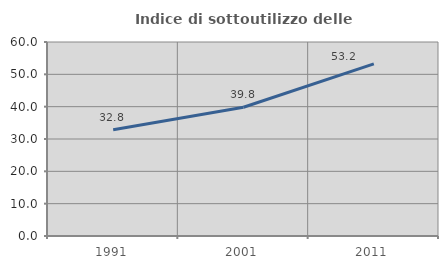
| Category | Indice di sottoutilizzo delle abitazioni  |
|---|---|
| 1991.0 | 32.836 |
| 2001.0 | 39.806 |
| 2011.0 | 53.242 |